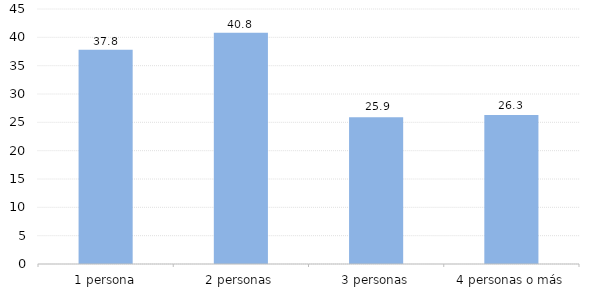
| Category | LA RIOJA |
|---|---|
| 1 persona | 37.8 |
| 2 personas | 40.8 |
| 3 personas | 25.9 |
| 4 personas o más | 26.3 |